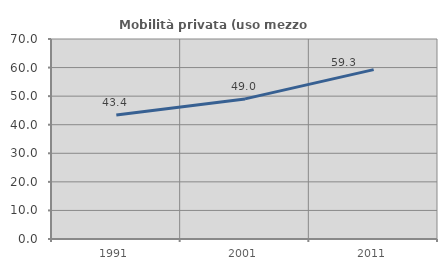
| Category | Mobilità privata (uso mezzo privato) |
|---|---|
| 1991.0 | 43.421 |
| 2001.0 | 49.038 |
| 2011.0 | 59.292 |